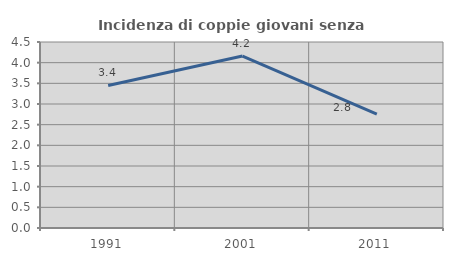
| Category | Incidenza di coppie giovani senza figli |
|---|---|
| 1991.0 | 3.448 |
| 2001.0 | 4.16 |
| 2011.0 | 2.754 |